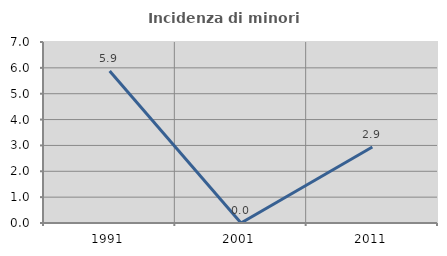
| Category | Incidenza di minori stranieri |
|---|---|
| 1991.0 | 5.882 |
| 2001.0 | 0 |
| 2011.0 | 2.941 |